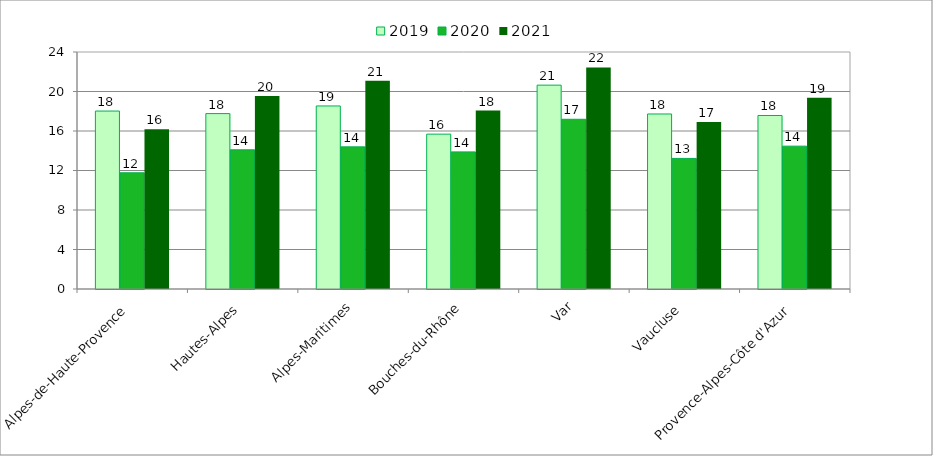
| Category | 2019 | 2020 | 2021 |
|---|---|---|---|
| Alpes-de-Haute-Provence | 18.019 | 11.77 | 16.166 |
| Hautes-Alpes | 17.761 | 14.096 | 19.546 |
| Alpes-Maritimes | 18.536 | 14.393 | 21.09 |
| Bouches-du-Rhône | 15.681 | 13.886 | 18.075 |
| Var | 20.642 | 17.187 | 22.44 |
| Vaucluse | 17.724 | 13.222 | 16.91 |
| Provence-Alpes-Côte d'Azur | 17.57 | 14.466 | 19.376 |